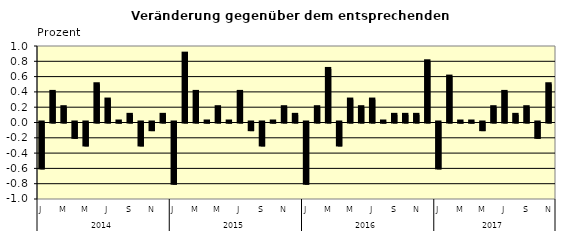
| Category | Series 0 |
|---|---|
| 0 | -0.6 |
| 1 | 0.4 |
| 2 | 0.2 |
| 3 | -0.2 |
| 4 | -0.3 |
| 5 | 0.5 |
| 6 | 0.3 |
| 7 | 0.01 |
| 8 | 0.1 |
| 9 | -0.3 |
| 10 | -0.1 |
| 11 | 0.1 |
| 12 | -0.8 |
| 13 | 0.9 |
| 14 | 0.4 |
| 15 | 0.01 |
| 16 | 0.2 |
| 17 | 0.01 |
| 18 | 0.4 |
| 19 | -0.1 |
| 20 | -0.3 |
| 21 | 0.01 |
| 22 | 0.2 |
| 23 | 0.1 |
| 24 | -0.8 |
| 25 | 0.2 |
| 26 | 0.7 |
| 27 | -0.3 |
| 28 | 0.3 |
| 29 | 0.2 |
| 30 | 0.3 |
| 31 | 0.01 |
| 32 | 0.1 |
| 33 | 0.1 |
| 34 | 0.1 |
| 35 | 0.8 |
| 36 | -0.6 |
| 37 | 0.6 |
| 38 | 0.01 |
| 39 | 0.01 |
| 40 | -0.1 |
| 41 | 0.2 |
| 42 | 0.4 |
| 43 | 0.1 |
| 44 | 0.2 |
| 45 | -0.2 |
| 46 | 0.5 |